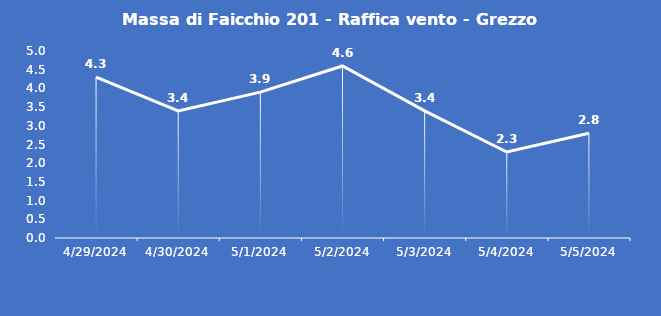
| Category | Massa di Faicchio 201 - Raffica vento - Grezzo (m/s) |
|---|---|
| 4/29/24 | 4.3 |
| 4/30/24 | 3.4 |
| 5/1/24 | 3.9 |
| 5/2/24 | 4.6 |
| 5/3/24 | 3.4 |
| 5/4/24 | 2.3 |
| 5/5/24 | 2.8 |